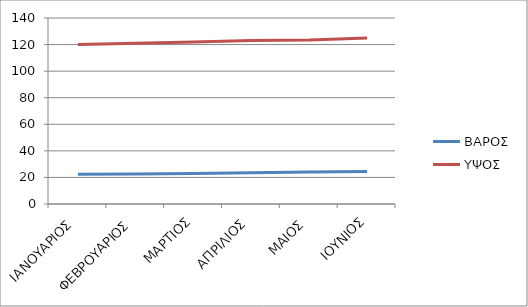
| Category | ΒΑΡΟΣ | ΥΨΟΣ |
|---|---|---|
| ΙΑΝΟΥΑΡΙΟΣ | 22.3 | 120 |
| ΦΕΒΡΟΥΑΡΙΟΣ | 22.5 | 121 |
| ΜΑΡΤΙΟΣ | 23 | 122 |
| ΑΠΡΙΛΙΟΣ | 23.5 | 123 |
| ΜΑΙΟΣ | 24 | 123.5 |
| ΙΟΥΝΙΟΣ | 24.5 | 125 |